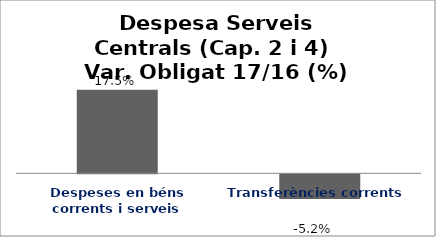
| Category | Series 0 |
|---|---|
| Despeses en béns corrents i serveis | 0.175 |
| Transferències corrents | -0.052 |